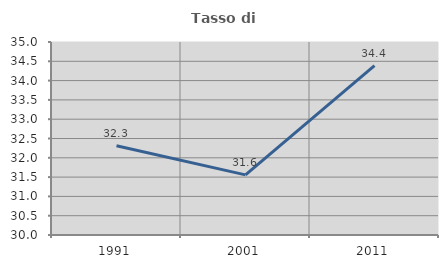
| Category | Tasso di occupazione   |
|---|---|
| 1991.0 | 32.311 |
| 2001.0 | 31.558 |
| 2011.0 | 34.386 |